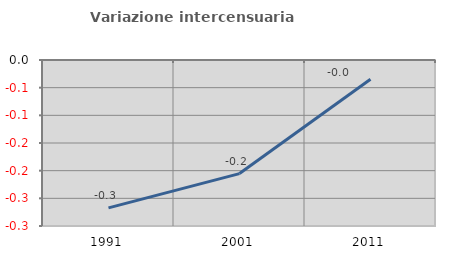
| Category | Variazione intercensuaria annua |
|---|---|
| 1991.0 | -0.267 |
| 2001.0 | -0.205 |
| 2011.0 | -0.035 |